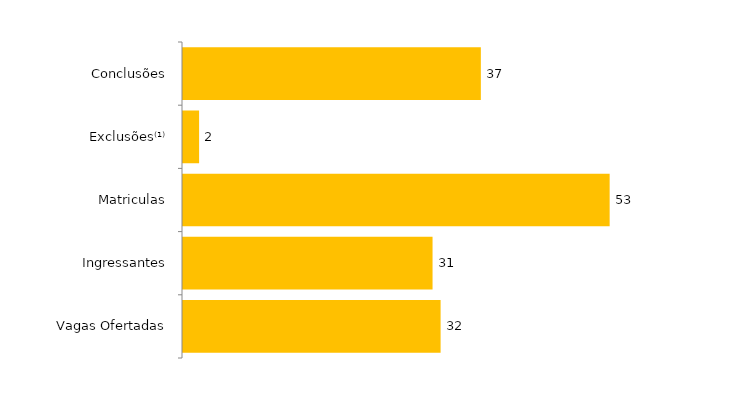
| Category | Total (2016) |
|---|---|
| Vagas Ofertadas | 32 |
| Ingressantes | 31 |
| Matriculas | 53 |
| Exclusões⁽¹⁾ | 2 |
| Conclusões | 37 |